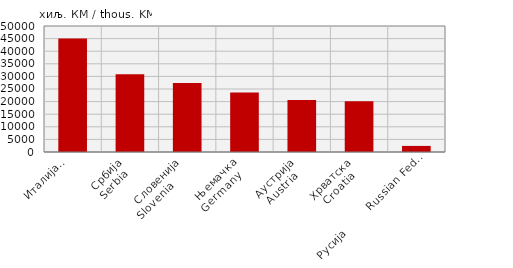
| Category | Извоз
Export |
|---|---|
| Италија
Italy  | 45075 |
| Србија
Serbia  | 30858 |
| Словенија
Slovenia       | 27341 |
| Њемачка
Germany   | 23599 |
| Аустрија
Austria   | 20679 |
| Хрватска
Croatia   | 20134 |
| Русија        Russian Federation | 2415 |